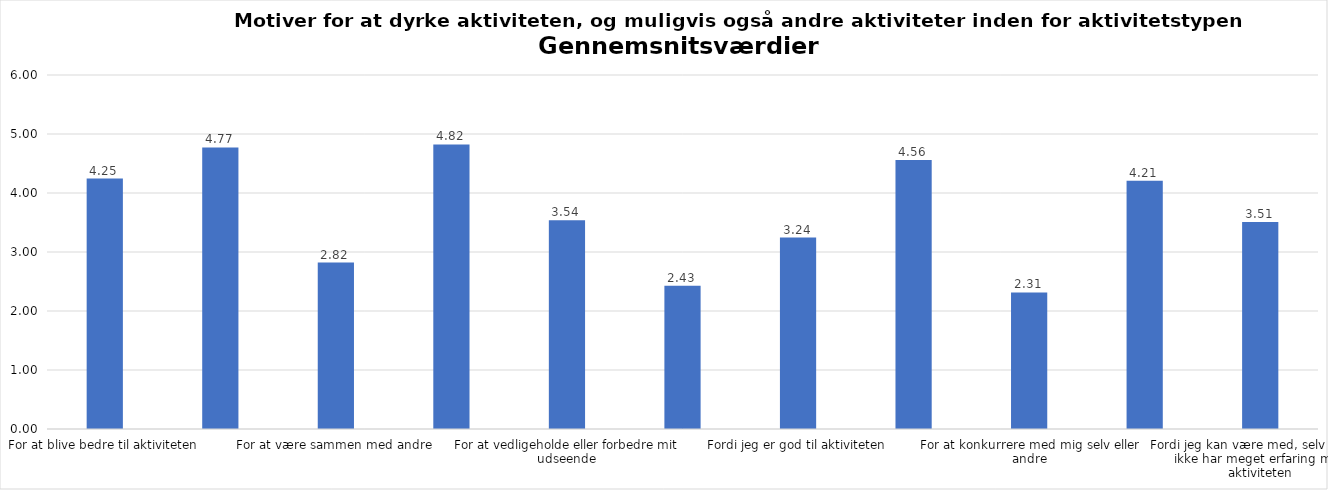
| Category | Gennemsnit |
|---|---|
| For at blive bedre til aktiviteten | 4.246 |
| For at vedligeholde eller forbedre min sundhed (fx helbred, fysisk form) | 4.773 |
| For at være sammen med andre | 2.821 |
| For at gøre noget godt for mig selv | 4.823 |
| For at vedligeholde eller forbedre mit udseende | 3.537 |
| Fordi andre i min omgangskreds opmuntrer mig til det | 2.426 |
| Fordi jeg er god til aktiviteten | 3.244 |
| Fordi jeg godt kan lide aktiviteten | 4.559 |
| For at konkurrere med mig selv eller andre | 2.314 |
| Fordi aktiviteten passer godt ind i min hverdag | 4.21 |
| Fordi jeg kan være med, selv om jeg ikke har meget erfaring med aktiviteten | 3.508 |